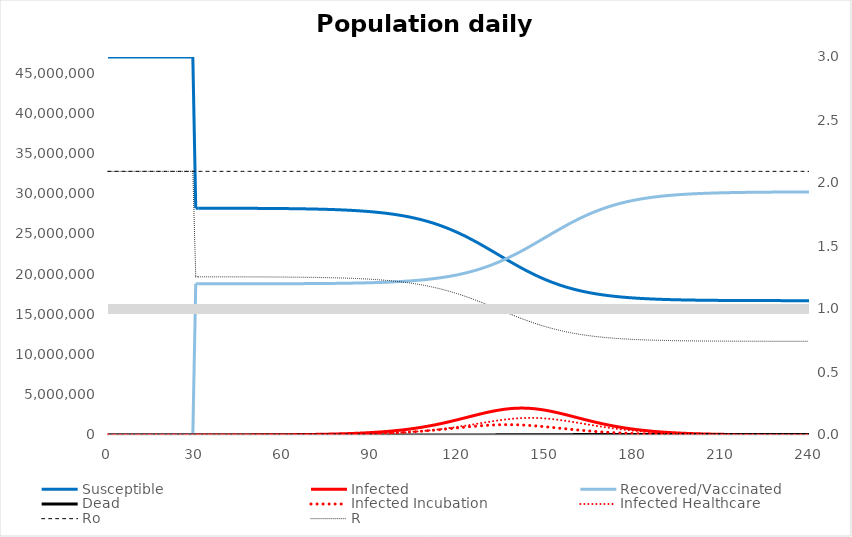
| Category | Susceptible | Infected | Recovered/Vaccinated | Dead | Infected Incubation | Infected Healthcare |
|---|---|---|---|---|---|---|
| 0.0 | 46999999 | 1 | 0 | 0 | 1 | 0 |
| 1.0 | 46999998.643 | 1.357 | 0 | 0 | 1.357 | 0 |
| 2.0 | 46999998.159 | 1.841 | 0 | 0 | 1.841 | 0 |
| 3.0 | 46999997.502 | 2.498 | 0 | 0 | 2.498 | 0 |
| 4.0 | 46999996.611 | 3.389 | 0 | 0 | 3.389 | 0 |
| 5.0 | 46999995.401 | 4.599 | 0 | 0 | 4.599 | 0 |
| 6.0 | 46999993.76 | 6.24 | 0 | 0 | 5.24 | 1 |
| 7.0 | 46999991.89 | 8.11 | 0 | 0 | 6.753 | 1.357 |
| 8.0 | 46999989.481 | 10.519 | 0 | 0 | 8.678 | 1.841 |
| 9.0 | 46999986.384 | 13.616 | 0 | 0 | 11.118 | 2.498 |
| 10.0 | 46999982.417 | 17.583 | 0 | 0 | 14.194 | 3.389 |
| 11.0 | 46999977.352 | 22.648 | 0 | 0 | 18.05 | 4.599 |
| 12.0 | 46999970.911 | 29.089 | 0 | 0 | 22.849 | 6.24 |
| 13.0 | 46999962.757 | 37.243 | 0 | 0 | 29.133 | 8.11 |
| 14.0 | 46999952.361 | 47.639 | 0 | 0 | 37.119 | 10.519 |
| 15.0 | 46999939.116 | 60.884 | 0 | 0 | 47.268 | 13.616 |
| 16.0 | 46999922.248 | 76.752 | 0.994 | 0.006 | 60.168 | 16.583 |
| 17.0 | 46999900.778 | 97.865 | 1.349 | 0.008 | 76.574 | 21.292 |
| 18.0 | 46999873.453 | 124.706 | 1.83 | 0.011 | 97.458 | 27.248 |
| 19.0 | 46999838.676 | 158.826 | 2.483 | 0.015 | 124.081 | 34.745 |
| 20.0 | 46999794.4 | 202.211 | 3.369 | 0.02 | 157.962 | 44.249 |
| 21.0 | 46999738.033 | 257.368 | 4.571 | 0.028 | 201.083 | 56.286 |
| 22.0 | 46999666.279 | 327.481 | 6.202 | 0.037 | 255.969 | 71.512 |
| 23.0 | 46999574.939 | 416.951 | 8.061 | 0.049 | 325.838 | 91.113 |
| 24.0 | 46999458.668 | 530.813 | 10.456 | 0.063 | 414.785 | 116.028 |
| 25.0 | 46999310.658 | 675.726 | 13.534 | 0.082 | 528.019 | 147.707 |
| 26.0 | 46999122.243 | 860.174 | 17.478 | 0.106 | 672.157 | 188.017 |
| 27.0 | 46998882.395 | 1094.957 | 22.513 | 0.136 | 855.638 | 239.319 |
| 28.0 | 46998577.077 | 1393.834 | 28.915 | 0.175 | 1089.202 | 304.632 |
| 29.0 | 46998188.419 | 1774.338 | 37.019 | 0.223 | 1386.521 | 387.818 |
| 30.0 | 28198616.204 | 2258.687 | 18799124.822 | 0.286 | 1764.994 | 493.693 |
| 31.0 | 28198238.332 | 2623.314 | 18799137.989 | 0.365 | 1994.856 | 628.458 |
| 32.0 | 28197811.255 | 3033.524 | 18799154.755 | 0.467 | 2233.518 | 800.006 |
| 33.0 | 28197333.09 | 3490.218 | 18799176.096 | 0.595 | 2471.835 | 1018.383 |
| 34.0 | 28196803.915 | 3992.069 | 18799203.257 | 0.759 | 2695.693 | 1296.376 |
| 35.0 | 28196226.827 | 4534.38 | 18799237.825 | 0.968 | 2884.123 | 1650.258 |
| 36.0 | 28195609.413 | 5107.517 | 18799281.836 | 1.234 | 3006.791 | 2100.726 |
| 37.0 | 28194965.753 | 5694.81 | 18799337.865 | 1.572 | 3272.579 | 2422.231 |
| 38.0 | 28194265.214 | 6323.596 | 18799409.188 | 2.002 | 3546.041 | 2777.554 |
| 39.0 | 28193506.156 | 6991.314 | 18799499.98 | 2.55 | 3826.935 | 3164.379 |
| 40.0 | 28192686.993 | 7694.206 | 18799615.553 | 3.248 | 4116.922 | 3577.284 |
| 41.0 | 28191805.785 | 8427.404 | 18799762.676 | 4.136 | 4421.042 | 4006.362 |
| 42.0 | 28190859.511 | 9185.262 | 18799949.96 | 5.267 | 4749.902 | 4435.36 |
| 43.0 | 28189842.885 | 9962.041 | 18800188.369 | 6.706 | 5122.868 | 4839.172 |
| 44.0 | 28188746.473 | 10753.134 | 18800491.855 | 8.538 | 5518.741 | 5234.394 |
| 45.0 | 28187565.383 | 11545.566 | 18800878.181 | 10.869 | 5940.773 | 5604.794 |
| 46.0 | 28186294.027 | 12322.177 | 18801369.958 | 13.838 | 6392.966 | 5929.211 |
| 47.0 | 28184925.964 | 13312.368 | 18801745.562 | 16.105 | 6879.82 | 6432.548 |
| 48.0 | 28183453.791 | 14357.464 | 18802170.077 | 18.668 | 7405.721 | 6951.744 |
| 49.0 | 28181869.169 | 15463.921 | 18802645.373 | 21.537 | 7973.716 | 7490.205 |
| 50.0 | 28180163.111 | 16640.804 | 18803171.374 | 24.712 | 8583.362 | 8057.442 |
| 51.0 | 28178326.729 | 17900.098 | 18803744.999 | 28.174 | 9238.654 | 8661.444 |
| 52.0 | 28176350.283 | 19259.13 | 18804358.708 | 31.879 | 9943.745 | 9315.386 |
| 53.0 | 28174223.15 | 20742.604 | 18804998.506 | 35.741 | 10702.814 | 10039.789 |
| 54.0 | 28171933.818 | 22331.395 | 18805694.842 | 39.944 | 11519.972 | 10811.423 |
| 55.0 | 28169469.905 | 24036.25 | 18806449.346 | 44.498 | 12399.264 | 11636.987 |
| 56.0 | 28166818.168 | 25868.825 | 18807263.594 | 49.413 | 13344.943 | 12523.882 |
| 57.0 | 28163964.465 | 27841.32 | 18808139.515 | 54.7 | 14362.264 | 13479.056 |
| 58.0 | 28160893.539 | 29965.973 | 18809080.111 | 60.378 | 15456.744 | 14509.229 |
| 59.0 | 28157588.966 | 32253.919 | 18810090.637 | 66.478 | 16634.183 | 15619.735 |
| 60.0 | 28154033.097 | 34713.376 | 18811180.471 | 73.056 | 17900.722 | 16812.654 |
| 61.0 | 28150206.982 | 37358.401 | 18812354.474 | 80.143 | 19262.923 | 18095.478 |
| 62.0 | 28146090.29 | 40203.737 | 18813618.202 | 87.771 | 20727.878 | 19475.859 |
| 63.0 | 28141661.194 | 43264.77 | 18814978.056 | 95.979 | 22303.271 | 20961.499 |
| 64.0 | 28136896.25 | 46557.541 | 18816441.397 | 104.812 | 23997.289 | 22560.252 |
| 65.0 | 28131770.291 | 50098.878 | 18818016.511 | 114.32 | 25818.675 | 24280.203 |
| 66.0 | 28126256.316 | 53906.795 | 18819712.332 | 124.557 | 27776.781 | 26130.014 |
| 67.0 | 28120325.364 | 58001.365 | 18821537.696 | 135.575 | 29881.618 | 28119.747 |
| 68.0 | 28113946.38 | 62403.902 | 18823502.284 | 147.433 | 32143.91 | 30259.992 |
| 69.0 | 28107086.069 | 67137.081 | 18825616.654 | 160.196 | 34575.125 | 32561.956 |
| 70.0 | 28099708.744 | 72225.075 | 18827892.249 | 173.932 | 37187.506 | 35037.569 |
| 71.0 | 28091776.174 | 77693.731 | 18830341.379 | 188.716 | 39994.117 | 37699.614 |
| 72.0 | 28083247.418 | 83570.75 | 18832977.206 | 204.626 | 43008.898 | 40561.852 |
| 73.0 | 28074078.648 | 89885.816 | 18835813.787 | 221.748 | 46246.716 | 43639.101 |
| 74.0 | 28064222.97 | 96670.568 | 18838866.287 | 240.174 | 49723.41 | 46947.158 |
| 75.0 | 28053630.232 | 103958.735 | 18842151.032 | 260.001 | 53455.837 | 50502.897 |
| 76.0 | 28042246.821 | 111786.276 | 18845685.567 | 281.337 | 57461.922 | 54324.353 |
| 77.0 | 28030015.467 | 120191.515 | 18849488.725 | 304.293 | 61760.707 | 58430.808 |
| 78.0 | 28016875.021 | 129215.269 | 18853580.716 | 328.993 | 66372.397 | 62842.872 |
| 79.0 | 28002760.241 | 138900.953 | 18857983.238 | 355.568 | 71318.407 | 67582.546 |
| 80.0 | 27987601.567 | 149294.683 | 18862719.593 | 384.158 | 76621.403 | 72673.279 |
| 81.0 | 27971324.887 | 160445.404 | 18867814.796 | 414.913 | 82305.345 | 78140.059 |
| 82.0 | 27953851.313 | 172405.003 | 18873295.687 | 447.997 | 88395.508 | 84009.495 |
| 83.0 | 27935096.944 | 185228.42 | 18879191.053 | 483.583 | 94918.523 | 90309.897 |
| 84.0 | 27914972.635 | 198973.745 | 18885531.763 | 521.857 | 101902.386 | 97071.36 |
| 85.0 | 27893383.765 | 213702.304 | 18892350.912 | 563.019 | 109376.476 | 104325.828 |
| 86.0 | 27870230.027 | 229478.717 | 18899683.974 | 607.283 | 117371.54 | 112107.177 |
| 87.0 | 27845405.202 | 246370.972 | 18907568.948 | 654.878 | 125919.684 | 120451.287 |
| 88.0 | 27818796.978 | 264450.44 | 18916046.531 | 706.051 | 135054.335 | 129396.105 |
| 89.0 | 27790286.759 | 283791.89 | 18925160.288 | 761.063 | 144810.186 | 138981.704 |
| 90.0 | 27759749.521 | 304473.45 | 18934956.832 | 820.197 | 155223.114 | 149250.335 |
| 91.0 | 27727053.69 | 326576.542 | 18945486.015 | 883.754 | 166330.075 | 160246.466 |
| 92.0 | 27692061.055 | 350185.766 | 18956801.125 | 952.054 | 178168.971 | 172016.795 |
| 93.0 | 27654626.732 | 375388.735 | 18968959.09 | 1025.442 | 190778.47 | 184610.265 |
| 94.0 | 27614599.182 | 402275.839 | 18982020.694 | 1104.285 | 204197.795 | 198078.043 |
| 95.0 | 27571820.293 | 430939.948 | 18996050.785 | 1188.974 | 218466.465 | 212473.483 |
| 96.0 | 27526125.53 | 461476.037 | 19011118.507 | 1279.926 | 233623.99 | 227852.046 |
| 97.0 | 27477344.189 | 493980.698 | 19027297.527 | 1377.586 | 249709.501 | 244271.197 |
| 98.0 | 27425299.726 | 528551.587 | 19044666.26 | 1482.427 | 266761.329 | 261790.257 |
| 99.0 | 27369810.221 | 565286.723 | 19063308.102 | 1594.954 | 284816.511 | 280470.212 |
| 100.0 | 27310688.948 | 604283.687 | 19083311.666 | 1715.699 | 303910.234 | 300373.453 |
| 101.0 | 27247745.095 | 645638.67 | 19104771.002 | 1845.233 | 324075.198 | 321563.472 |
| 102.0 | 27180784.619 | 689445.408 | 19127785.818 | 1984.155 | 345340.912 | 344104.496 |
| 103.0 | 27109611.316 | 735793.887 | 19152461.694 | 2133.104 | 367732.873 | 368061.013 |
| 104.0 | 27034028.001 | 784768.976 | 19178910.269 | 2292.753 | 391271.725 | 393497.252 |
| 105.0 | 26953837.924 | 836448.835 | 19207249.427 | 2463.815 | 415972.298 | 420476.537 |
| 106.0 | 26868846.372 | 890903.148 | 19237603.441 | 2647.038 | 441842.576 | 449060.572 |
| 107.0 | 26778862.502 | 948191.188 | 19270103.097 | 2843.213 | 468882.593 | 479308.595 |
| 108.0 | 26683701.341 | 1008359.714 | 19304885.776 | 3053.169 | 497083.278 | 511276.437 |
| 109.0 | 26583186.017 | 1071440.715 | 19342095.493 | 3277.775 | 526425.298 | 545015.417 |
| 110.0 | 26477150.222 | 1137448.96 | 19381882.878 | 3517.94 | 556877.779 | 580571.181 |
| 111.0 | 26365440.826 | 1206379.467 | 19424405.093 | 3774.613 | 588397.098 | 617982.369 |
| 112.0 | 26247920.709 | 1278204.821 | 19469825.688 | 4048.782 | 620925.663 | 657279.158 |
| 113.0 | 26124471.721 | 1352872.468 | 19518314.341 | 4341.47 | 654390.781 | 698481.687 |
| 114.0 | 25994997.708 | 1430302.018 | 19570046.537 | 4653.737 | 688703.633 | 741598.385 |
| 115.0 | 25859427.721 | 1510382.501 | 19625203.105 | 4986.674 | 723758.297 | 786624.204 |
| 116.0 | 25717719.157 | 1592969.791 | 19683969.65 | 5341.402 | 759431.065 | 833538.726 |
| 117.0 | 25569860.858 | 1677884.237 | 19746535.84 | 5719.065 | 795579.968 | 882304.269 |
| 118.0 | 25415876.174 | 1764908.445 | 19813094.554 | 6120.828 | 832044.535 | 932863.91 |
| 119.0 | 25255825.709 | 1853785.606 | 19883840.817 | 6547.867 | 868646.012 | 985139.594 |
| 120.0 | 25089809.911 | 1944218.09 | 19958970.631 | 7001.367 | 905187.796 | 1039030.293 |
| 121.0 | 24917971.246 | 2035866.678 | 20038679.568 | 7482.508 | 941456.475 | 1094410.203 |
| 122.0 | 24740495.9 | 2128350.472 | 20123161.171 | 7992.457 | 977223.257 | 1151127.215 |
| 123.0 | 24557614.962 | 2221247.54 | 20212605.137 | 8532.36 | 1012245.896 | 1209001.644 |
| 124.0 | 24369605.039 | 2314096.302 | 20307195.332 | 9103.327 | 1046271.135 | 1267825.167 |
| 125.0 | 24176788.056 | 2406397.962 | 20407107.563 | 9706.419 | 1079037.653 | 1327360.308 |
| 126.0 | 23979530.442 | 2497619.78 | 20512507.144 | 10342.634 | 1110279.469 | 1387340.311 |
| 127.0 | 23778241.415 | 2587199.412 | 20623546.283 | 11012.89 | 1139729.832 | 1447469.58 |
| 128.0 | 23573370.513 | 2674550.196 | 20740361.28 | 11718.011 | 1167125.387 | 1507424.809 |
| 129.0 | 23365404.314 | 2759067.407 | 20863069.574 | 12458.705 | 1192210.648 | 1566856.759 |
| 130.0 | 23154862.411 | 2840135.296 | 20991766.743 | 13235.549 | 1214742.628 | 1625392.669 |
| 131.0 | 22942292.579 | 2917135.142 | 21126523.31 | 14048.969 | 1234495.477 | 1682639.665 |
| 132.0 | 22728265.373 | 2989453.784 | 21267381.622 | 14899.22 | 1251265.069 | 1738188.715 |
| 133.0 | 22513368.226 | 3056492.633 | 21414352.771 | 15786.37 | 1264873.189 | 1791619.444 |
| 134.0 | 22298199.025 | 3117677.149 | 21567413.548 | 16710.278 | 1275171.487 | 1842505.661 |
| 135.0 | 22083359.563 | 3172466.146 | 21726503.71 | 17670.581 | 1282044.751 | 1890421.395 |
| 136.0 | 21869448.755 | 3220361.156 | 21891523.413 | 18666.676 | 1285413.656 | 1934947.5 |
| 137.0 | 21657056.062 | 3260915.185 | 22062331.046 | 19697.708 | 1285236.517 | 1975678.668 |
| 138.0 | 21446754.936 | 3293740.964 | 22238741.54 | 20762.56 | 1281510.437 | 2012230.527 |
| 139.0 | 21239096.776 | 3318518.187 | 22420525.192 | 21859.846 | 1274271.45 | 2044246.737 |
| 140.0 | 21034605.313 | 3334999.726 | 22607407.056 | 22987.905 | 1263593.712 | 2071406.014 |
| 141.0 | 20833771.622 | 3343016.434 | 22799067.137 | 24144.807 | 1249587.941 | 2093428.492 |
| 142.0 | 20637049.804 | 3342480.638 | 22995141.205 | 25328.353 | 1232398.951 | 2110081.687 |
| 143.0 | 20444853.492 | 3333387.923 | 23195222.498 | 26536.087 | 1212202.57 | 2121185.353 |
| 144.0 | 20257553.159 | 3315817.353 | 23398864.175 | 27765.312 | 1189201.777 | 2126615.577 |
| 145.0 | 20075474.206 | 3289930.108 | 23605582.576 | 29013.11 | 1163622.569 | 2126307.539 |
| 146.0 | 19898895.927 | 3255966.484 | 23814861.228 | 30276.361 | 1135709.386 | 2120257.098 |
| 147.0 | 19728051.24 | 3214241.339 | 24026155.641 | 31551.78 | 1105720.382 | 2108520.957 |
| 148.0 | 19563127.132 | 3165138.241 | 24238898.684 | 32835.943 | 1073922.672 | 2091215.569 |
| 149.0 | 19404265.769 | 3109102.457 | 24452506.448 | 34125.326 | 1040587.723 | 2068514.734 |
| 150.0 | 19251566.2 | 3046632.826 | 24666384.633 | 35416.341 | 1005986.96 | 2040645.866 |
| 151.0 | 19105086.555 | 2978273.008 | 24879935.059 | 36705.378 | 970387.651 | 2007885.357 |
| 152.0 | 18964846.608 | 2904602.147 | 25092562.402 | 37988.843 | 934049.319 | 1970552.828 |
| 153.0 | 18830830.665 | 2826225.397 | 25303680.739 | 39263.199 | 897220.575 | 1929004.822 |
| 154.0 | 18702990.694 | 2743764.243 | 25512720.058 | 40525.006 | 860136.438 | 1883627.804 |
| 155.0 | 18581249.531 | 2657847.245 | 25719132.269 | 41770.955 | 823016.238 | 1834831.007 |
| 156.0 | 18465504.199 | 2569101.114 | 25922396.783 | 42997.904 | 786062 | 1783039.114 |
| 157.0 | 18355629.167 | 2478142.455 | 26122025.472 | 44202.906 | 749457.388 | 1728685.067 |
| 158.0 | 18251479.585 | 2385570.218 | 26317566.959 | 45383.237 | 713367.023 | 1672203.196 |
| 159.0 | 18152894.354 | 2291959.138 | 26508610.093 | 46536.415 | 677936.311 | 1614022.827 |
| 160.0 | 18059699.077 | 2197854.083 | 26694786.624 | 47660.217 | 643291.617 | 1554562.466 |
| 161.0 | 17971708.82 | 2103765.386 | 26875773.103 | 48752.69 | 609540.711 | 1494224.675 |
| 162.0 | 17888730.645 | 2010165.282 | 27051291.913 | 49812.16 | 576773.554 | 1433391.728 |
| 163.0 | 17810565.951 | 1917485.288 | 27221111.532 | 50837.228 | 545063.216 | 1372422.073 |
| 164.0 | 17737012.581 | 1826114.551 | 27385046.095 | 51826.773 | 514467.005 | 1311647.546 |
| 165.0 | 17667866.683 | 1736399.085 | 27542954.29 | 52779.941 | 485027.671 | 1251371.415 |
| 166.0 | 17602924.401 | 1648641.799 | 27694737.662 | 53696.138 | 456774.676 | 1191867.123 |
| 167.0 | 17541983.297 | 1563103.258 | 27840338.428 | 54575.016 | 429725.523 | 1133377.736 |
| 168.0 | 17484843.603 | 1480003.005 | 27979736.936 | 55416.456 | 403887.042 | 1076115.963 |
| 169.0 | 17431309.282 | 1399521.383 | 28112948.784 | 56220.552 | 379256.67 | 1020264.713 |
| 170.0 | 17381188.89 | 1321801.804 | 28240021.715 | 56987.592 | 355823.691 | 965978.113 |
| 171.0 | 17334296.303 | 1246953.228 | 28361032.43 | 57718.038 | 333570.381 | 913382.848 |
| 172.0 | 17290451.29 | 1175052.909 | 28476083.29 | 58412.51 | 312473.111 | 862579.798 |
| 173.0 | 17249479.943 | 1106149.224 | 28585299.072 | 59071.761 | 292503.354 | 813645.87 |
| 174.0 | 17211215.004 | 1040264.581 | 28688823.756 | 59696.658 | 273628.599 | 766635.983 |
| 175.0 | 17175496.087 | 977398.267 | 28786817.477 | 60288.17 | 255813.194 | 721585.072 |
| 176.0 | 17142169.805 | 917529.272 | 28879453.582 | 60847.341 | 239019.085 | 678510.187 |
| 177.0 | 17111089.826 | 860618.994 | 28966915.897 | 61375.283 | 223206.477 | 637412.517 |
| 178.0 | 17082116.867 | 806613.778 | 29049396.203 | 61873.152 | 208334.423 | 598279.355 |
| 179.0 | 17055118.615 | 755447.337 | 29127091.909 | 62342.14 | 194361.329 | 561086.008 |
| 180.0 | 17029969.626 | 707042.955 | 29200203.959 | 62783.46 | 181245.378 | 525797.577 |
| 181.0 | 17006551.166 | 661315.517 | 29268934.981 | 63198.336 | 168944.921 | 492370.596 |
| 182.0 | 16984751.029 | 618173.372 | 29333487.61 | 63587.989 | 157418.776 | 460754.596 |
| 183.0 | 16964463.342 | 577519.955 | 29394063.067 | 63953.636 | 146626.484 | 430893.471 |
| 184.0 | 16945588.333 | 539255.27 | 29450859.923 | 64296.474 | 136528.534 | 402726.736 |
| 185.0 | 16928032.101 | 503277.181 | 29504073.038 | 64617.68 | 127086.514 | 376190.667 |
| 186.0 | 16911706.364 | 469482.525 | 29553892.708 | 64918.402 | 118263.262 | 351219.264 |
| 187.0 | 16896528.221 | 437768.082 | 29600503.939 | 65199.758 | 110022.945 | 327745.137 |
| 188.0 | 16882419.888 | 408031.402 | 29644085.882 | 65462.828 | 102331.141 | 305700.261 |
| 189.0 | 16869308.456 | 380171.488 | 29684811.401 | 65708.656 | 95154.887 | 285016.601 |
| 190.0 | 16857125.635 | 354089.369 | 29722846.75 | 65938.246 | 88462.698 | 265626.671 |
| 191.0 | 16845807.518 | 329688.57 | 29758351.354 | 66152.559 | 82224.583 | 247463.987 |
| 192.0 | 16835294.333 | 306875.472 | 29791477.679 | 66352.517 | 76412.031 | 230463.44 |
| 193.0 | 16825530.219 | 285559.607 | 29822371.177 | 66538.997 | 70998.002 | 214561.605 |
| 194.0 | 16816462.999 | 265653.868 | 29851170.298 | 66712.835 | 65956.889 | 199696.979 |
| 195.0 | 16808043.963 | 247074.652 | 29878006.561 | 66874.824 | 61264.493 | 185810.159 |
| 196.0 | 16800227.661 | 229741.965 | 29903004.656 | 67025.718 | 56897.974 | 172843.991 |
| 197.0 | 16792971.707 | 213579.459 | 29926282.605 | 67166.229 | 52835.811 | 160743.648 |
| 198.0 | 16786236.59 | 198514.438 | 29947951.942 | 67297.03 | 49057.743 | 149456.696 |
| 199.0 | 16779985.492 | 184477.851 | 29968117.902 | 67418.756 | 45544.727 | 138933.123 |
| 200.0 | 16774184.117 | 171404.217 | 29986879.661 | 67532.006 | 42278.882 | 129125.334 |
| 201.0 | 16768800.532 | 159231.568 | 30004330.556 | 67637.343 | 39243.431 | 119988.138 |
| 202.0 | 16763805.013 | 147901.351 | 30020558.338 | 67735.298 | 36422.648 | 111478.704 |
| 203.0 | 16759169.9 | 137358.321 | 30035645.413 | 67826.366 | 33801.808 | 103556.514 |
| 204.0 | 16754869.458 | 127550.429 | 30049669.096 | 67911.016 | 31367.132 | 96183.298 |
| 205.0 | 16750879.756 | 118428.699 | 30062701.859 | 67989.685 | 29105.735 | 89322.964 |
| 206.0 | 16747178.539 | 109947.096 | 30074811.583 | 68062.782 | 27005.577 | 82941.518 |
| 207.0 | 16743745.12 | 102062.398 | 30086061.792 | 68130.691 | 25055.412 | 77006.986 |
| 208.0 | 16740560.268 | 94734.065 | 30096511.897 | 68193.77 | 23244.745 | 71489.32 |
| 209.0 | 16737606.117 | 87924.102 | 30106217.426 | 68252.354 | 21563.783 | 66360.32 |
| 210.0 | 16734866.063 | 81596.936 | 30115230.243 | 68306.758 | 20003.395 | 61593.541 |
| 211.0 | 16732324.685 | 75719.278 | 30123598.765 | 68357.272 | 18555.071 | 57164.206 |
| 212.0 | 16729967.658 | 70260.003 | 30131368.169 | 68404.17 | 17210.882 | 53049.121 |
| 213.0 | 16727781.678 | 65190.029 | 30138580.587 | 68447.706 | 15963.442 | 49226.587 |
| 214.0 | 16725754.392 | 60482.198 | 30145275.294 | 68488.116 | 14805.876 | 45676.322 |
| 215.0 | 16723874.332 | 56111.159 | 30151488.886 | 68525.623 | 13731.785 | 42379.375 |
| 216.0 | 16722130.85 | 52053.267 | 30157255.452 | 68560.431 | 12735.214 | 39318.053 |
| 217.0 | 16720514.061 | 48286.471 | 30162606.735 | 68592.733 | 11810.624 | 36475.847 |
| 218.0 | 16719014.793 | 44790.22 | 30167572.281 | 68622.706 | 10952.864 | 33837.355 |
| 219.0 | 16717624.531 | 41545.368 | 30172179.584 | 68650.516 | 10157.146 | 31388.222 |
| 220.0 | 16716335.374 | 38534.084 | 30176454.223 | 68676.319 | 9419.018 | 29115.066 |
| 221.0 | 16715139.99 | 35739.766 | 30180419.986 | 68700.257 | 8734.342 | 27005.424 |
| 222.0 | 16714031.576 | 33146.964 | 30184098.996 | 68722.465 | 8099.274 | 25047.69 |
| 223.0 | 16713003.819 | 30741.301 | 30187511.815 | 68743.065 | 7510.243 | 23231.058 |
| 224.0 | 16712050.864 | 28509.404 | 30190677.558 | 68762.174 | 6963.93 | 21545.475 |
| 225.0 | 16711167.278 | 26438.839 | 30193613.984 | 68779.899 | 6457.254 | 19981.586 |
| 226.0 | 16710348.02 | 24518.043 | 30196337.597 | 68796.339 | 5987.354 | 18530.689 |
| 227.0 | 16709588.417 | 22736.268 | 30198863.727 | 68811.588 | 5551.573 | 17184.695 |
| 228.0 | 16708884.131 | 21083.527 | 30201206.612 | 68825.73 | 5147.445 | 15936.082 |
| 229.0 | 16708231.14 | 19550.538 | 30203379.476 | 68838.846 | 4772.679 | 14777.859 |
| 230.0 | 16707625.714 | 18128.678 | 30205394.598 | 68851.009 | 4425.15 | 13703.529 |
| 231.0 | 16707064.393 | 16809.94 | 30207263.378 | 68862.29 | 4102.885 | 12707.055 |
| 232.0 | 16706543.966 | 15586.883 | 30208996.4 | 68872.751 | 3804.054 | 11782.83 |
| 233.0 | 16706061.46 | 14452.602 | 30210603.487 | 68882.451 | 3526.957 | 10925.645 |
| 234.0 | 16705614.112 | 13400.681 | 30212093.76 | 68891.447 | 3270.018 | 10130.662 |
| 235.0 | 16705199.365 | 12425.166 | 30213475.68 | 68899.789 | 3031.775 | 9393.391 |
| 236.0 | 16704814.844 | 11520.53 | 30214757.102 | 68907.524 | 2810.87 | 8709.66 |
| 237.0 | 16704458.349 | 10681.641 | 30215945.314 | 68914.696 | 2606.044 | 8075.597 |
| 238.0 | 16704127.838 | 9903.738 | 30217047.078 | 68921.346 | 2416.129 | 7487.609 |
| 239.0 | 16703821.418 | 9182.401 | 30218068.668 | 68927.513 | 2240.042 | 6942.359 |
| 240.0 | 16703537.336 | 8513.528 | 30219015.906 | 68933.231 | 2076.777 | 6436.751 |